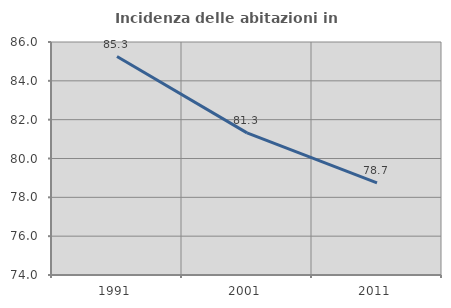
| Category | Incidenza delle abitazioni in proprietà  |
|---|---|
| 1991.0 | 85.252 |
| 2001.0 | 81.319 |
| 2011.0 | 78.741 |